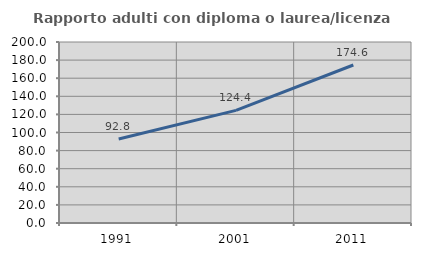
| Category | Rapporto adulti con diploma o laurea/licenza media  |
|---|---|
| 1991.0 | 92.779 |
| 2001.0 | 124.439 |
| 2011.0 | 174.605 |